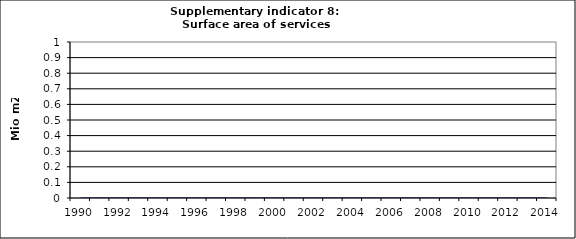
| Category | Surface area of services buildings, Mio m2 |
|---|---|
| 1990 | 0 |
| 1991 | 0 |
| 1992 | 0 |
| 1993 | 0 |
| 1994 | 0 |
| 1995 | 0 |
| 1996 | 0 |
| 1997 | 0 |
| 1998 | 0 |
| 1999 | 0 |
| 2000 | 0 |
| 2001 | 0 |
| 2002 | 0 |
| 2003 | 0 |
| 2004 | 0 |
| 2005 | 0 |
| 2006 | 0 |
| 2007 | 0 |
| 2008 | 0 |
| 2009 | 0 |
| 2010 | 0 |
| 2011 | 0 |
| 2012 | 0 |
| 2013 | 0 |
| 2014 | 0 |